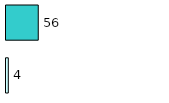
| Category | Series 0 | Series 1 |
|---|---|---|
| 0 | 4 | 56 |